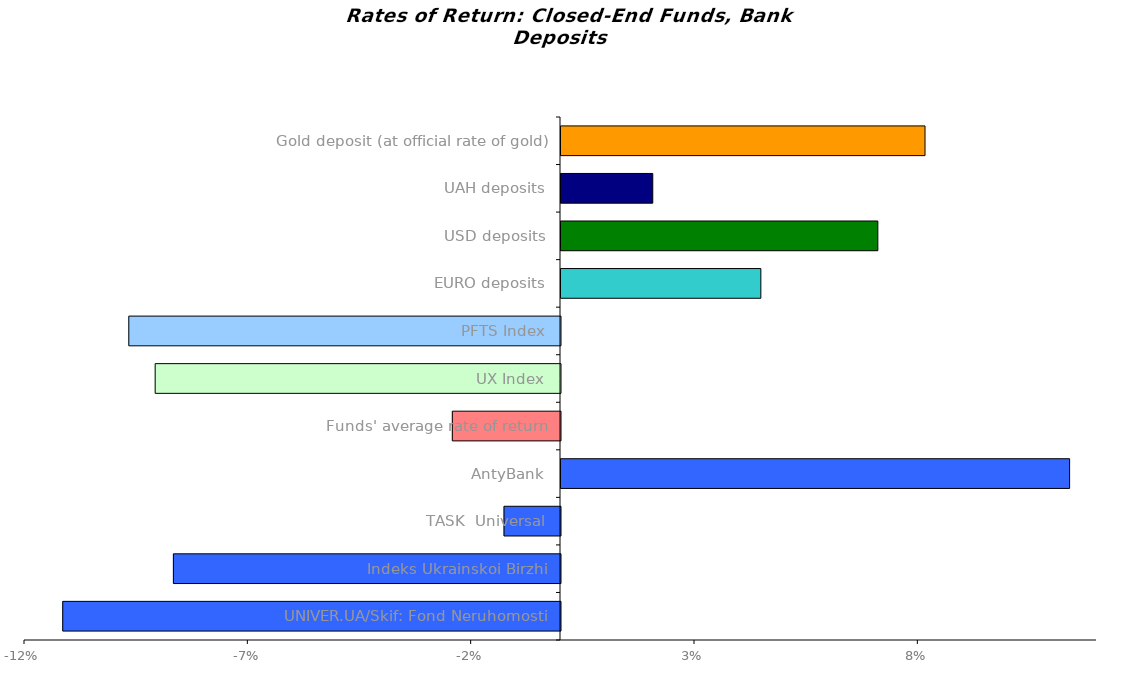
| Category | Series 0 |
|---|---|
| UNIVER.UA/Skif: Fond Neruhomosti | -0.111 |
| Indeks Ukrainskoi Birzhi | -0.087 |
| TASK  Universal | -0.013 |
| AntyBank | 0.114 |
| Funds' average rate of return | -0.024 |
| UX Index | -0.091 |
| PFTS Index | -0.097 |
| EURO deposits | 0.045 |
| USD deposits | 0.071 |
| UAH deposits | 0.021 |
| Gold deposit (at official rate of gold) | 0.081 |